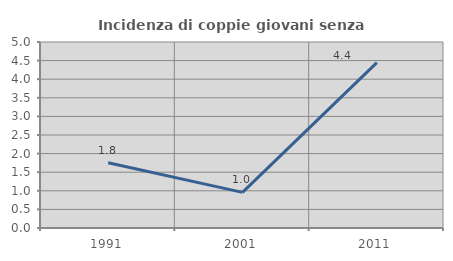
| Category | Incidenza di coppie giovani senza figli |
|---|---|
| 1991.0 | 1.754 |
| 2001.0 | 0.957 |
| 2011.0 | 4.444 |